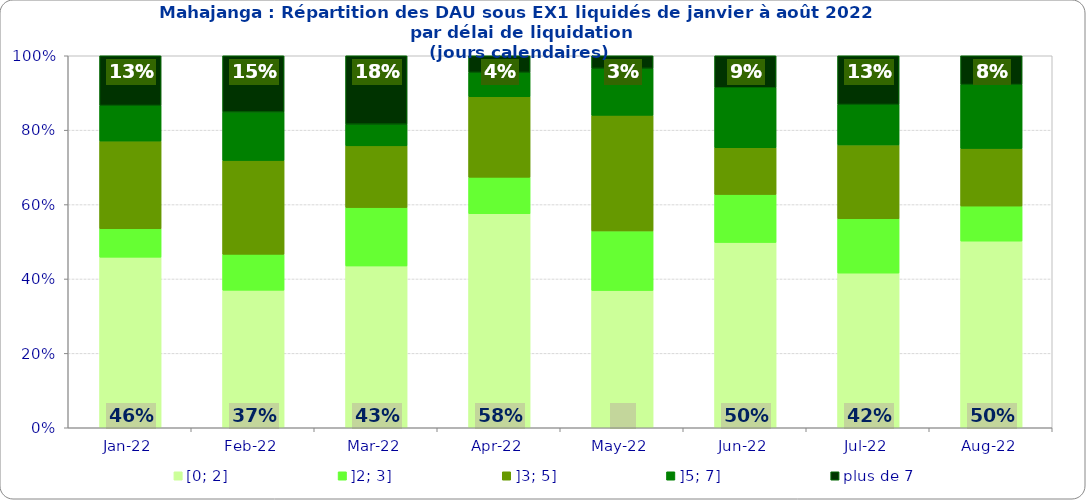
| Category | [0; 2] | ]2; 3] | ]3; 5] | ]5; 7] | plus de 7 |
|---|---|---|---|---|---|
| 2022-01-01 | 0.459 | 0.076 | 0.236 | 0.096 | 0.134 |
| 2022-02-01 | 0.37 | 0.097 | 0.252 | 0.13 | 0.151 |
| 2022-03-01 | 0.435 | 0.157 | 0.166 | 0.058 | 0.184 |
| 2022-04-01 | 0.576 | 0.098 | 0.216 | 0.065 | 0.045 |
| 2022-05-01 | 0.369 | 0.16 | 0.311 | 0.126 | 0.034 |
| 2022-06-01 | 0.498 | 0.129 | 0.125 | 0.161 | 0.086 |
| 2022-07-01 | 0.416 | 0.146 | 0.199 | 0.109 | 0.131 |
| 2022-08-01 | 0.502 | 0.094 | 0.155 | 0.172 | 0.077 |